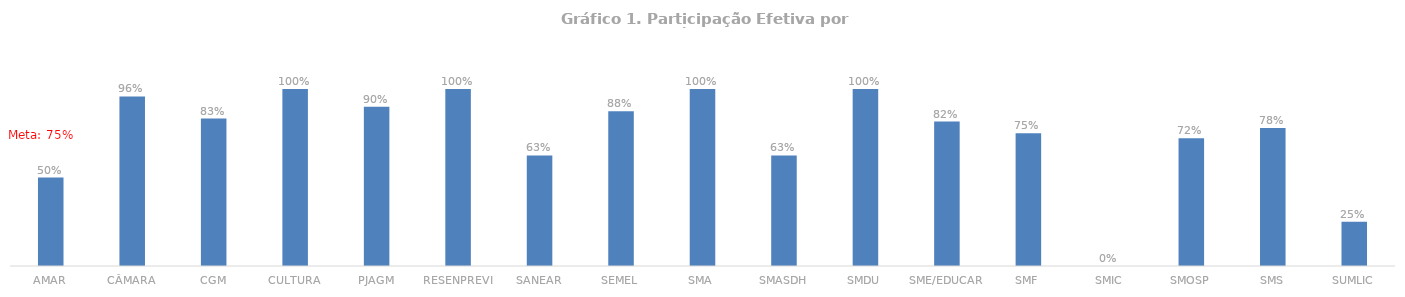
| Category | Total |
|---|---|
| AMAR | 0.5 |
| CÂMARA | 0.958 |
| CGM | 0.833 |
| CULTURA | 1 |
| PJAGM | 0.9 |
| RESENPREVI | 1 |
| SANEAR | 0.625 |
| SEMEL | 0.875 |
| SMA | 1 |
| SMASDH | 0.625 |
| SMDU | 1 |
| SME/EDUCAR | 0.817 |
| SMF | 0.75 |
| SMIC | 0 |
| SMOSP | 0.722 |
| SMS | 0.78 |
| SUMLIC | 0.25 |